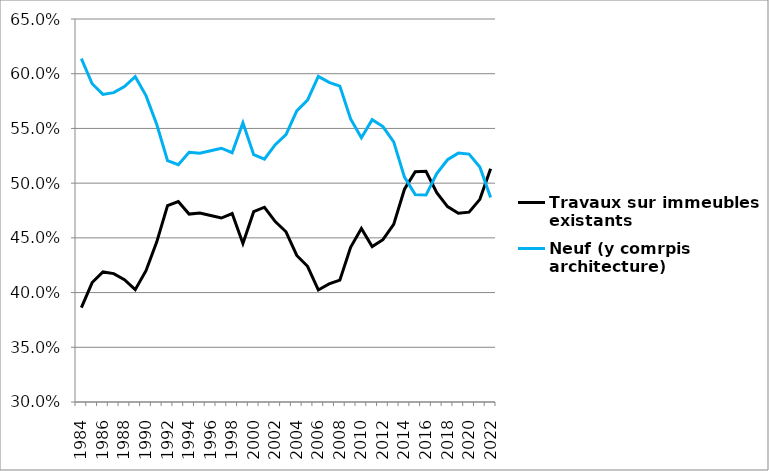
| Category | Travaux sur immeubles existants | Neuf (y comrpis architecture) |
|---|---|---|
| 1984.0 | 0.386 | 0.614 |
| 1985.0 | 0.409 | 0.591 |
| 1986.0 | 0.419 | 0.581 |
| 1987.0 | 0.417 | 0.583 |
| 1988.0 | 0.412 | 0.588 |
| 1989.0 | 0.403 | 0.597 |
| 1990.0 | 0.42 | 0.58 |
| 1991.0 | 0.446 | 0.554 |
| 1992.0 | 0.479 | 0.521 |
| 1993.0 | 0.483 | 0.517 |
| 1994.0 | 0.472 | 0.528 |
| 1995.0 | 0.473 | 0.527 |
| 1996.0 | 0.47 | 0.53 |
| 1997.0 | 0.468 | 0.532 |
| 1998.0 | 0.472 | 0.528 |
| 1999.0 | 0.445 | 0.555 |
| 2000.0 | 0.474 | 0.526 |
| 2001.0 | 0.478 | 0.522 |
| 2002.0 | 0.465 | 0.535 |
| 2003.0 | 0.456 | 0.544 |
| 2004.0 | 0.434 | 0.566 |
| 2005.0 | 0.424 | 0.576 |
| 2006.0 | 0.402 | 0.598 |
| 2007.0 | 0.408 | 0.592 |
| 2008.0 | 0.411 | 0.589 |
| 2009.0 | 0.441 | 0.559 |
| 2010.0 | 0.459 | 0.541 |
| 2011.0 | 0.442 | 0.558 |
| 2012.0 | 0.448 | 0.552 |
| 2013.0 | 0.462 | 0.538 |
| 2014.0 | 0.494 | 0.506 |
| 2015.0 | 0.511 | 0.489 |
| 2016.0 | 0.511 | 0.489 |
| 2017.0 | 0.491 | 0.509 |
| 2018.0 | 0.479 | 0.521 |
| 2019.0 | 0.473 | 0.527 |
| 2020.0 | 0.473 | 0.527 |
| 2021.0 | 0.485 | 0.515 |
| 2022.0 | 0.513 | 0.487 |